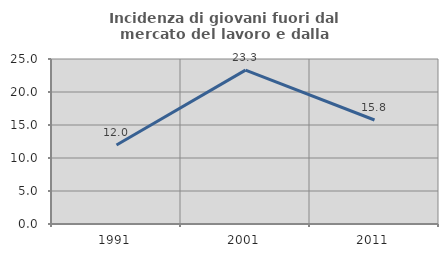
| Category | Incidenza di giovani fuori dal mercato del lavoro e dalla formazione  |
|---|---|
| 1991.0 | 11.977 |
| 2001.0 | 23.318 |
| 2011.0 | 15.755 |